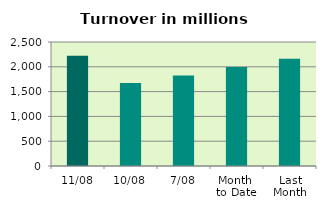
| Category | Series 0 |
|---|---|
| 11/08 | 2221.018 |
| 10/08 | 1674.99 |
| 7/08 | 1822.952 |
| Month 
to Date | 1995.927 |
| Last
Month | 2162.227 |